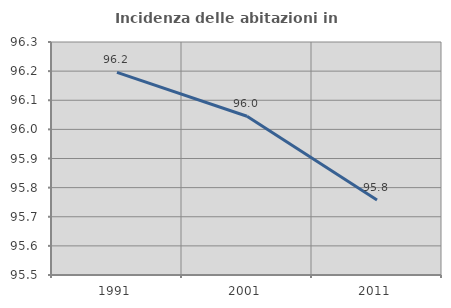
| Category | Incidenza delle abitazioni in proprietà  |
|---|---|
| 1991.0 | 96.196 |
| 2001.0 | 96.045 |
| 2011.0 | 95.758 |